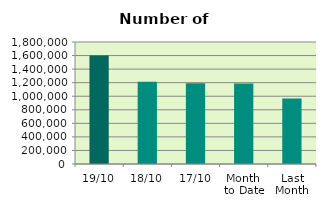
| Category | Series 0 |
|---|---|
| 19/10 | 1602248 |
| 18/10 | 1213200 |
| 17/10 | 1190260 |
| Month 
to Date | 1185871.867 |
| Last
Month | 967047.5 |